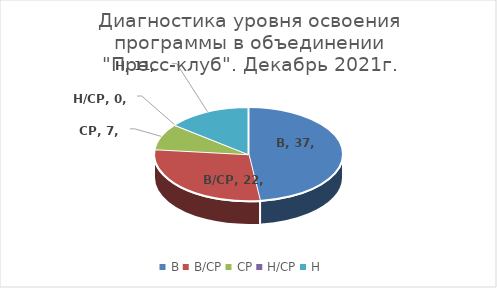
| Category | Series 0 |
|---|---|
| В | 37 |
| В/СР | 22 |
| СР | 7 |
| Н/СР | 0 |
| Н | 11 |